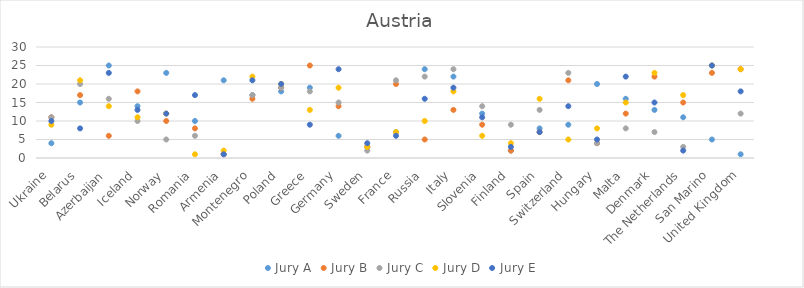
| Category | Jury A | Jury B | Jury C | Jury D | Jury E |
|---|---|---|---|---|---|
| Ukraine | 4 | 11 | 11 | 9 | 10 |
| Belarus | 15 | 17 | 20 | 21 | 8 |
| Azerbaijan | 25 | 6 | 16 | 14 | 23 |
| Iceland | 14 | 18 | 10 | 11 | 13 |
| Norway | 23 | 10 | 5 | 12 | 12 |
| Romania | 10 | 8 | 6 | 1 | 17 |
| Armenia | 21 | 1 | 1 | 2 | 1 |
| Montenegro | 17 | 16 | 17 | 22 | 21 |
| Poland | 18 | 19 | 19 | 20 | 20 |
| Greece | 19 | 25 | 18 | 13 | 9 |
| Germany | 6 | 14 | 15 | 19 | 24 |
| Sweden | 3 | 3 | 2 | 3 | 4 |
| France | 7 | 20 | 21 | 7 | 6 |
| Russia | 24 | 5 | 22 | 10 | 16 |
| Italy | 22 | 13 | 24 | 18 | 19 |
| Slovenia | 12 | 9 | 14 | 6 | 11 |
| Finland | 2 | 2 | 9 | 4 | 3 |
| Spain | 8 | 7 | 13 | 16 | 7 |
| Switzerland | 9 | 21 | 23 | 5 | 14 |
| Hungary | 20 | 4 | 4 | 8 | 5 |
| Malta | 16 | 12 | 8 | 15 | 22 |
| Denmark | 13 | 22 | 7 | 23 | 15 |
| The Netherlands | 11 | 15 | 3 | 17 | 2 |
| San Marino | 5 | 23 | 25 | 25 | 25 |
| United Kingdom | 1 | 24 | 12 | 24 | 18 |